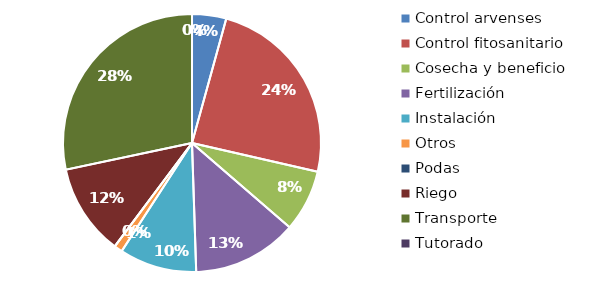
| Category | Valor |
|---|---|
| Control arvenses | 850000 |
| Control fitosanitario | 4830000 |
| Cosecha y beneficio | 1540800 |
| Fertilización | 2610000 |
| Instalación | 1926000 |
| Otros | 206867.2 |
| Podas | 0 |
| Riego | 2278500 |
| Transporte | 5626800 |
| Tutorado | 0 |